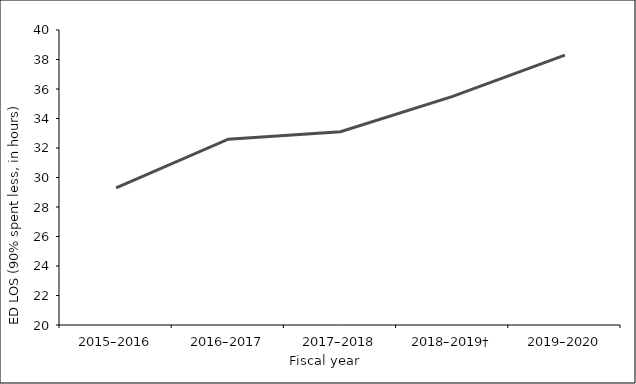
| Category | Series 0 |
|---|---|
| 2015–2016 | 29.3 |
| 2016–2017 | 32.6 |
| 2017–2018 | 33.1 |
| 2018–2019† | 35.5 |
| 2019–2020 | 38.3 |